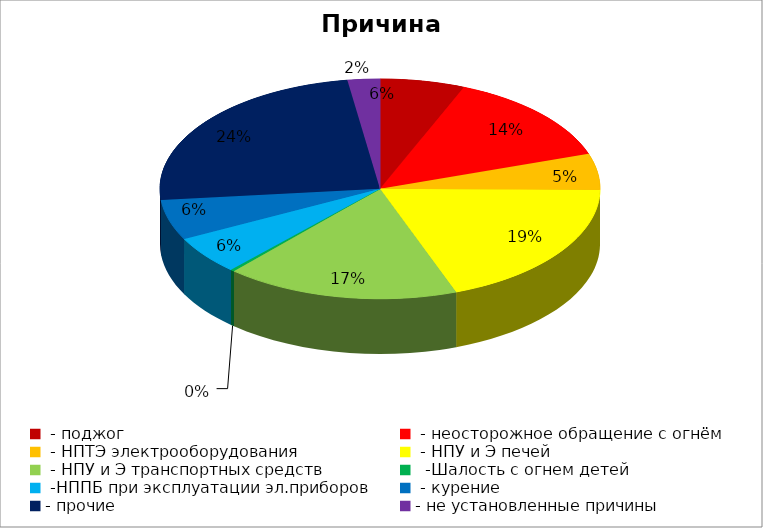
| Category | Причина пожара |
|---|---|
|  - поджог | 21 |
|  - неосторожное обращение с огнём | 46 |
|  - НПТЭ электрооборудования | 18 |
|  - НПУ и Э печей | 65 |
|  - НПУ и Э транспортных средств | 58 |
|   -Шалость с огнем детей | 1 |
|  -НППБ при эксплуатации эл.приборов | 19 |
|  - курение | 20 |
| - прочие | 82 |
| - не установленные причины | 8 |